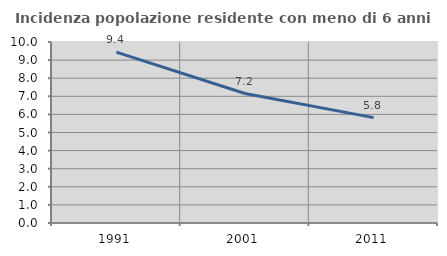
| Category | Incidenza popolazione residente con meno di 6 anni |
|---|---|
| 1991.0 | 9.441 |
| 2001.0 | 7.153 |
| 2011.0 | 5.821 |